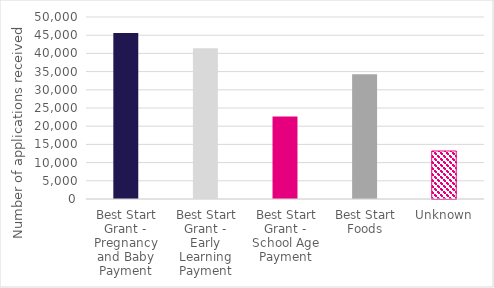
| Category | Series 0 |
|---|---|
| Best Start Grant - Pregnancy and Baby Payment | 45590 |
| Best Start Grant - Early Learning Payment | 41445 |
| Best Start Grant - School Age Payment | 22645 |
| Best Start Foods | 34275 |
| Unknown | 13190 |